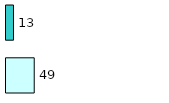
| Category | Series 0 | Series 1 |
|---|---|---|
| 0 | 49 | 13 |